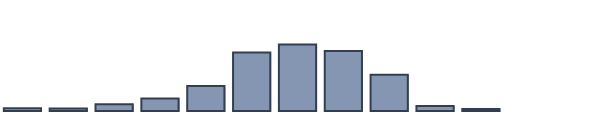
| Category | Series 0 |
|---|---|
| 0 | 0.985 |
| 1 | 0.909 |
| 2 | 2.424 |
| 3 | 4.47 |
| 4 | 9.015 |
| 5 | 21.061 |
| 6 | 23.939 |
| 7 | 21.591 |
| 8 | 13.03 |
| 9 | 1.818 |
| 10 | 0.758 |
| 11 | 0 |
| 12 | 0 |